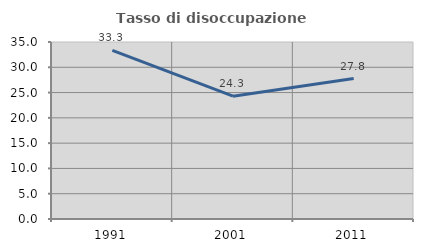
| Category | Tasso di disoccupazione giovanile  |
|---|---|
| 1991.0 | 33.333 |
| 2001.0 | 24.286 |
| 2011.0 | 27.778 |